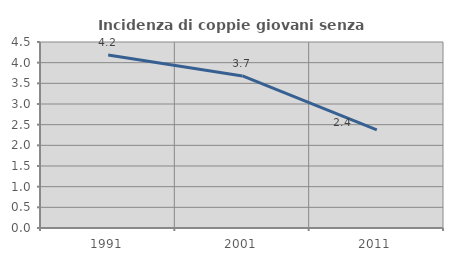
| Category | Incidenza di coppie giovani senza figli |
|---|---|
| 1991.0 | 4.186 |
| 2001.0 | 3.679 |
| 2011.0 | 2.376 |